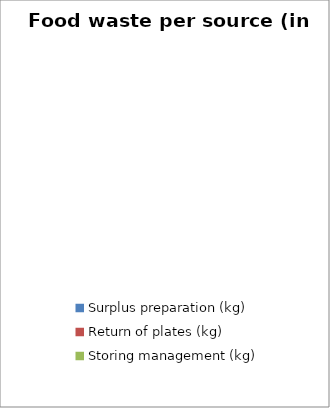
| Category | Series 0 |
|---|---|
| Surplus preparation (kg) | 0 |
| Return of plates (kg) | 0 |
| Storing management (kg) | 0 |